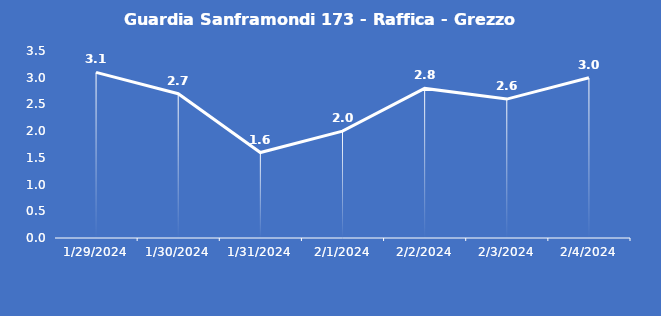
| Category | Guardia Sanframondi 173 - Raffica - Grezzo (m/s) |
|---|---|
| 1/29/24 | 3.1 |
| 1/30/24 | 2.7 |
| 1/31/24 | 1.6 |
| 2/1/24 | 2 |
| 2/2/24 | 2.8 |
| 2/3/24 | 2.6 |
| 2/4/24 | 3 |